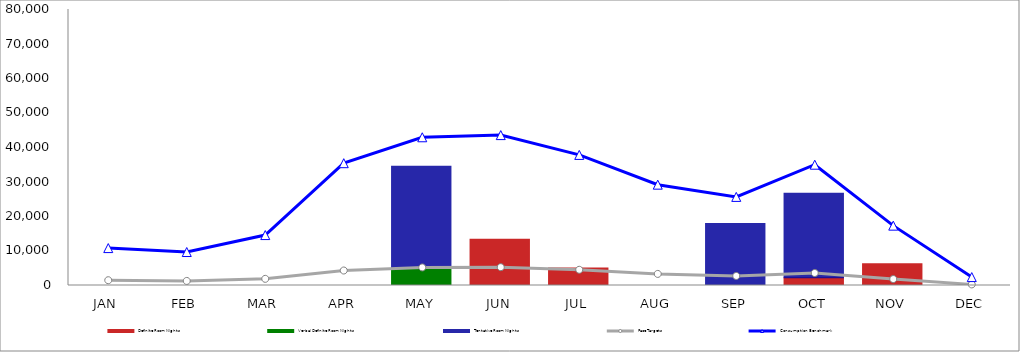
| Category | Definite Room Nights | Verbal Definite Room Nights | Tentative Room Nights |
|---|---|---|---|
| JAN | 0 | 0 | 0 |
| FEB | 0 | 0 | 0 |
| MAR | 0 | 0 | 0 |
| APR | 0 | 0 | 0 |
| MAY | 0 | 5000 | 29530 |
| JUN | 13408 | 0 | 0 |
| JUL | 5044 | 0 | 0 |
| AUG | 0 | 0 | 0 |
| SEP | 0 | 0 | 17990 |
| OCT | 2245 | 0 | 24484 |
| NOV | 6317 | 0 | 0 |
| DEC | 0 | 0 | 0 |